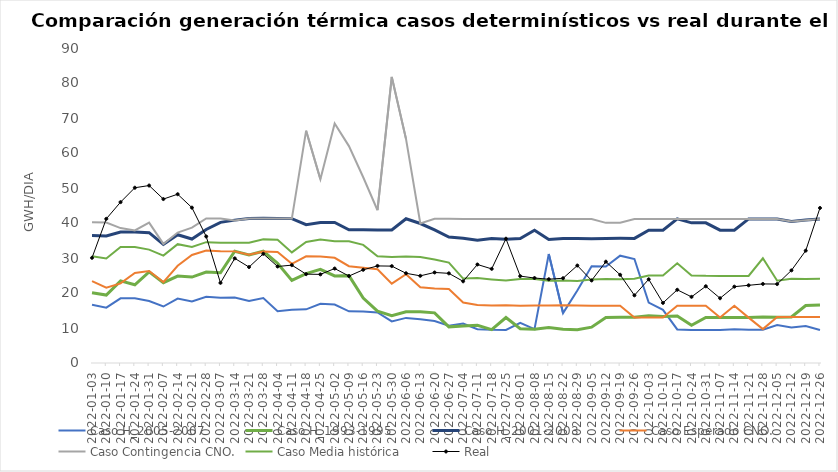
| Category | Caso H_2005-2007 | Caso H_1993-1995 | Caso H_2001-2003 | Caso Esperado CNO. | Caso Contingencia CNO. | Caso Media histórica | Real |
|---|---|---|---|---|---|---|---|
| 2022-01-03 | 16.624 | 20.097 | 36.417 | 23.38 | 40.195 | 30.494 | 30.051 |
| 2022-01-10 | 15.808 | 19.411 | 36.28 | 21.526 | 40.14 | 29.865 | 41.188 |
| 2022-01-17 | 18.472 | 23.474 | 37.428 | 22.748 | 38.551 | 33.156 | 45.968 |
| 2022-01-24 | 18.514 | 22.351 | 37.442 | 25.726 | 37.875 | 33.139 | 50.075 |
| 2022-01-31 | 17.717 | 26.043 | 37.243 | 26.276 | 40.098 | 32.395 | 50.702 |
| 2022-02-07 | 16.142 | 22.934 | 33.893 | 23.131 | 34.023 | 30.695 | 46.839 |
| 2022-02-14 | 18.394 | 24.827 | 36.652 | 27.785 | 37.27 | 33.955 | 48.228 |
| 2022-02-21 | 17.551 | 24.554 | 35.418 | 30.853 | 38.677 | 33.182 | 44.38 |
| 2022-02-28 | 18.908 | 25.966 | 38.151 | 32.127 | 41.317 | 34.523 | 36.153 |
| 2022-03-07 | 18.646 | 25.789 | 40.179 | 31.963 | 41.282 | 34.39 | 22.887 |
| 2022-03-14 | 18.683 | 31.929 | 40.821 | 31.893 | 40.72 | 34.347 | 29.896 |
| 2022-03-21 | 17.746 | 30.903 | 41.285 | 30.911 | 41.279 | 34.353 | 27.411 |
| 2022-03-28 | 18.568 | 31.925 | 41.372 | 31.866 | 41.278 | 35.321 | 31.194 |
| 2022-04-04 | 14.821 | 28.506 | 41.266 | 31.738 | 41.256 | 35.184 | 27.575 |
| 2022-04-11 | 15.189 | 23.597 | 41.25 | 28.336 | 41.252 | 31.602 | 27.963 |
| 2022-04-18 | 15.339 | 25.53 | 39.51 | 30.496 | 66.379 | 34.555 | 25.388 |
| 2022-04-25 | 16.924 | 26.758 | 40.145 | 30.447 | 52.517 | 35.254 | 25.32 |
| 2022-05-02 | 16.688 | 24.875 | 40.151 | 30.064 | 68.456 | 34.815 | 26.99 |
| 2022-05-09 | 14.751 | 24.96 | 38.081 | 27.666 | 61.973 | 34.808 | 24.843 |
| 2022-05-16 | 14.706 | 18.557 | 38.059 | 27.191 | 53.07 | 33.753 | 26.631 |
| 2022-05-23 | 14.458 | 14.806 | 38.016 | 26.807 | 43.649 | 30.497 | 27.735 |
| 2022-05-30 | 11.867 | 13.493 | 38 | 22.676 | 81.741 | 30.304 | 27.682 |
| 2022-06-06 | 12.885 | 14.644 | 41.222 | 25.368 | 63.976 | 30.43 | 25.632 |
| 2022-06-13 | 12.466 | 14.667 | 39.853 | 21.663 | 39.873 | 30.305 | 24.902 |
| 2022-06-20 | 12.007 | 14.322 | 38.012 | 21.286 | 41.197 | 29.579 | 25.866 |
| 2022-06-27 | 10.63 | 10.328 | 36.008 | 21.121 | 41.192 | 28.688 | 25.616 |
| 2022-07-04 | 11.26 | 10.597 | 35.624 | 17.27 | 41.167 | 24.119 | 23.343 |
| 2022-07-11 | 9.661 | 10.782 | 35.043 | 16.586 | 41.167 | 24.281 | 28.145 |
| 2022-07-18 | 9.486 | 9.539 | 35.6 | 16.399 | 41.167 | 23.891 | 26.889 |
| 2022-07-25 | 9.443 | 12.999 | 35.351 | 16.504 | 41.167 | 23.56 | 35.507 |
| 2022-08-01 | 11.443 | 9.808 | 35.581 | 16.345 | 41.167 | 24.01 | 24.817 |
| 2022-08-08 | 9.696 | 9.661 | 37.949 | 16.408 | 41.167 | 23.997 | 24.278 |
| 2022-08-15 | 31.155 | 10.141 | 35.293 | 16.431 | 41.167 | 23.474 | 23.934 |
| 2022-08-22 | 14.259 | 9.653 | 35.556 | 16.482 | 41.167 | 23.539 | 24.213 |
| 2022-08-29 | 20.716 | 9.481 | 35.599 | 16.423 | 41.167 | 23.454 | 27.847 |
| 2022-09-05 | 27.653 | 10.237 | 35.53 | 16.35 | 41.167 | 23.843 | 23.584 |
| 2022-09-12 | 27.546 | 13.023 | 35.581 | 16.346 | 40.042 | 23.99 | 28.944 |
| 2022-09-19 | 30.661 | 13.054 | 35.609 | 16.369 | 40.07 | 23.934 | 25.2 |
| 2022-09-26 | 29.705 | 13.062 | 35.607 | 13.004 | 41.167 | 24.053 | 19.337 |
| 2022-10-03 | 17.279 | 13.502 | 37.949 | 12.978 | 41.167 | 25.002 | 23.911 |
| 2022-10-10 | 15.175 | 13.316 | 37.949 | 12.999 | 41.167 | 25.022 | 17.176 |
| 2022-10-17 | 9.592 | 13.446 | 41.167 | 16.388 | 41.167 | 28.49 | 20.915 |
| 2022-10-24 | 9.449 | 10.757 | 40.042 | 16.388 | 41.167 | 25.031 | 18.901 |
| 2022-10-31 | 9.441 | 13.003 | 40.042 | 16.377 | 41.167 | 24.897 | 21.921 |
| 2022-11-07 | 9.398 | 13.002 | 37.949 | 12.982 | 41.167 | 24.881 | 18.505 |
| 2022-11-14 | 9.616 | 13.012 | 37.949 | 16.355 | 41.167 | 24.871 | 21.808 |
| 2022-11-21 | 9.478 | 12.965 | 41.167 | 12.968 | 41.167 | 24.867 | 22.199 |
| 2022-11-28 | 9.497 | 13.145 | 41.167 | 9.687 | 41.167 | 29.908 | 22.591 |
| 2022-12-05 | 10.868 | 13.036 | 41.167 | 13.168 | 41.167 | 23.487 | 22.555 |
| 2022-12-12 | 10.174 | 13.136 | 40.42 | 13.156 | 40.42 | 24.053 | 26.464 |
| 2022-12-19 | 10.557 | 16.438 | 40.836 | 13.152 | 40.815 | 24.031 | 32.092 |
| 2022-12-26 | 9.448 | 16.575 | 41.122 | 13.168 | 41.122 | 24.043 | 44.299 |